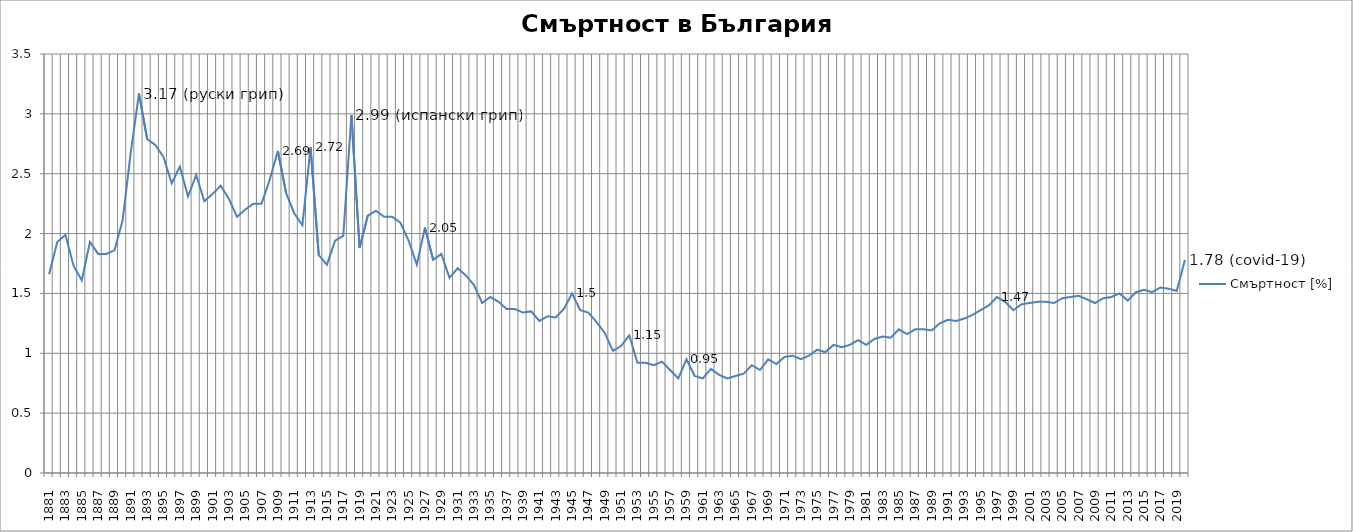
| Category | Смъртност [%] |
|---|---|
| 1881.0 | 1.66 |
| 1882.0 | 1.93 |
| 1883.0 | 1.99 |
| 1884.0 | 1.73 |
| 1885.0 | 1.61 |
| 1886.0 | 1.93 |
| 1887.0 | 1.83 |
| 1888.0 | 1.83 |
| 1889.0 | 1.86 |
| 1890.0 | 2.11 |
| 1891.0 | 2.68 |
| 1892.0 | 3.17 |
| 1893.0 | 2.79 |
| 1894.0 | 2.74 |
| 1895.0 | 2.64 |
| 1896.0 | 2.42 |
| 1897.0 | 2.56 |
| 1898.0 | 2.31 |
| 1899.0 | 2.49 |
| 1900.0 | 2.27 |
| 1901.0 | 2.33 |
| 1902.0 | 2.4 |
| 1903.0 | 2.29 |
| 1904.0 | 2.14 |
| 1905.0 | 2.2 |
| 1906.0 | 2.25 |
| 1907.0 | 2.25 |
| 1908.0 | 2.45 |
| 1909.0 | 2.69 |
| 1910.0 | 2.34 |
| 1911.0 | 2.17 |
| 1912.0 | 2.07 |
| 1913.0 | 2.72 |
| 1914.0 | 1.82 |
| 1915.0 | 1.74 |
| 1916.0 | 1.94 |
| 1917.0 | 1.98 |
| 1918.0 | 2.99 |
| 1919.0 | 1.88 |
| 1920.0 | 2.15 |
| 1921.0 | 2.19 |
| 1922.0 | 2.14 |
| 1923.0 | 2.14 |
| 1924.0 | 2.09 |
| 1925.0 | 1.94 |
| 1926.0 | 1.74 |
| 1927.0 | 2.05 |
| 1928.0 | 1.78 |
| 1929.0 | 1.83 |
| 1930.0 | 1.63 |
| 1931.0 | 1.71 |
| 1932.0 | 1.65 |
| 1933.0 | 1.57 |
| 1934.0 | 1.42 |
| 1935.0 | 1.47 |
| 1936.0 | 1.43 |
| 1937.0 | 1.37 |
| 1938.0 | 1.37 |
| 1939.0 | 1.34 |
| 1940.0 | 1.35 |
| 1941.0 | 1.27 |
| 1942.0 | 1.31 |
| 1943.0 | 1.3 |
| 1944.0 | 1.37 |
| 1945.0 | 1.5 |
| 1946.0 | 1.36 |
| 1947.0 | 1.34 |
| 1948.0 | 1.26 |
| 1949.0 | 1.17 |
| 1950.0 | 1.02 |
| 1951.0 | 1.06 |
| 1952.0 | 1.15 |
| 1953.0 | 0.92 |
| 1954.0 | 0.92 |
| 1955.0 | 0.9 |
| 1956.0 | 0.93 |
| 1957.0 | 0.86 |
| 1958.0 | 0.79 |
| 1959.0 | 0.95 |
| 1960.0 | 0.81 |
| 1961.0 | 0.79 |
| 1962.0 | 0.87 |
| 1963.0 | 0.82 |
| 1964.0 | 0.79 |
| 1965.0 | 0.81 |
| 1966.0 | 0.83 |
| 1967.0 | 0.9 |
| 1968.0 | 0.86 |
| 1969.0 | 0.95 |
| 1970.0 | 0.91 |
| 1971.0 | 0.97 |
| 1972.0 | 0.98 |
| 1973.0 | 0.95 |
| 1974.0 | 0.98 |
| 1975.0 | 1.03 |
| 1976.0 | 1.01 |
| 1977.0 | 1.07 |
| 1978.0 | 1.05 |
| 1979.0 | 1.07 |
| 1980.0 | 1.11 |
| 1981.0 | 1.07 |
| 1982.0 | 1.12 |
| 1983.0 | 1.14 |
| 1984.0 | 1.13 |
| 1985.0 | 1.2 |
| 1986.0 | 1.16 |
| 1987.0 | 1.2 |
| 1988.0 | 1.2 |
| 1989.0 | 1.19 |
| 1990.0 | 1.25 |
| 1991.0 | 1.28 |
| 1992.0 | 1.27 |
| 1993.0 | 1.29 |
| 1994.0 | 1.32 |
| 1995.0 | 1.36 |
| 1996.0 | 1.4 |
| 1997.0 | 1.47 |
| 1998.0 | 1.43 |
| 1999.0 | 1.36 |
| 2000.0 | 1.41 |
| 2001.0 | 1.42 |
| 2002.0 | 1.43 |
| 2003.0 | 1.43 |
| 2004.0 | 1.42 |
| 2005.0 | 1.46 |
| 2006.0 | 1.47 |
| 2007.0 | 1.48 |
| 2008.0 | 1.45 |
| 2009.0 | 1.42 |
| 2010.0 | 1.46 |
| 2011.0 | 1.47 |
| 2012.0 | 1.5 |
| 2013.0 | 1.44 |
| 2014.0 | 1.51 |
| 2015.0 | 1.53 |
| 2016.0 | 1.51 |
| 2017.0 | 1.55 |
| 2018.0 | 1.54 |
| 2019.0 | 1.52 |
| 2020.0 | 1.78 |